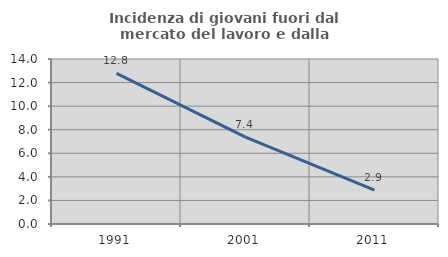
| Category | Incidenza di giovani fuori dal mercato del lavoro e dalla formazione  |
|---|---|
| 1991.0 | 12.785 |
| 2001.0 | 7.368 |
| 2011.0 | 2.878 |